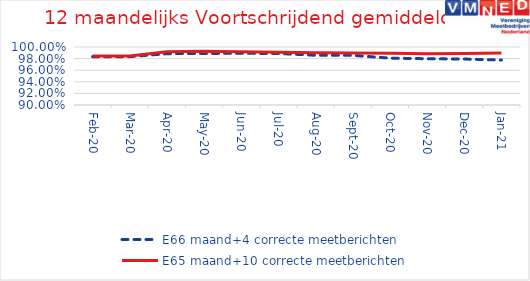
| Category | E66 maand+4 correcte meetberichten | E65 maand+10 correcte meetberichten |
|---|---|---|
| 2020-02-01 | 0.983 | 0.985 |
| 2020-03-01 | 0.983 | 0.984 |
| 2020-04-01 | 0.988 | 0.992 |
| 2020-05-01 | 0.989 | 0.993 |
| 2020-06-01 | 0.989 | 0.992 |
| 2020-07-01 | 0.989 | 0.991 |
| 2020-08-01 | 0.986 | 0.99 |
| 2020-09-01 | 0.986 | 0.99 |
| 2020-10-01 | 0.981 | 0.989 |
| 2020-11-01 | 0.98 | 0.989 |
| 2020-12-01 | 0.979 | 0.989 |
| 2021-01-01 | 0.978 | 0.99 |